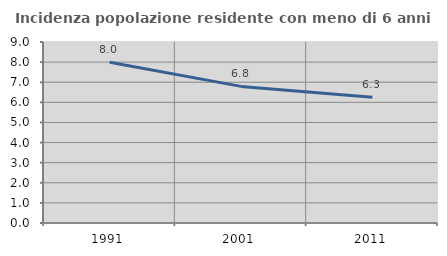
| Category | Incidenza popolazione residente con meno di 6 anni |
|---|---|
| 1991.0 | 7.993 |
| 2001.0 | 6.793 |
| 2011.0 | 6.25 |